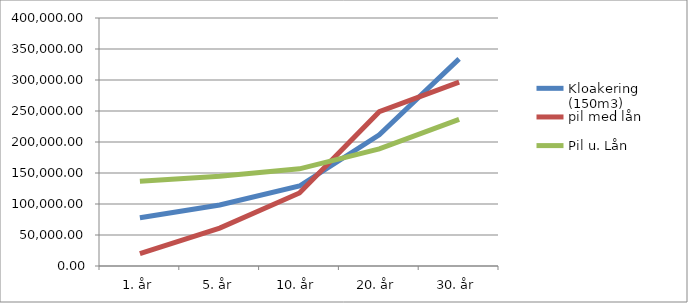
| Category | Kloakering (150m3) | pil med lån | Pil u. Lån |
|---|---|---|---|
| 1. år | 77872.07 | 19832.429 | 136811.429 |
| 5. år | 98407.97 | 61203.281 | 144811.281 |
| 10. år | 129050.468 | 117749.705 | 156748.205 |
| 20. år | 211690.135 | 248813.862 | 188940.862 |
| 30. år | 334017.031 | 296466.859 | 236593.859 |